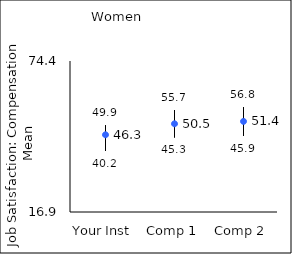
| Category | 25th percentile | 75th percentile | Mean |
|---|---|---|---|
| Your Inst | 40.2 | 49.9 | 46.31 |
| Comp 1 | 45.3 | 55.7 | 50.5 |
| Comp 2 | 45.9 | 56.8 | 51.4 |